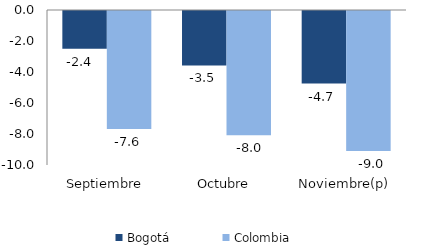
| Category | Bogotá | Colombia |
|---|---|---|
| Septiembre | -2.434 | -7.614 |
| Octubre | -3.511 | -8.012 |
| Noviembre(p) | -4.678 | -9.036 |